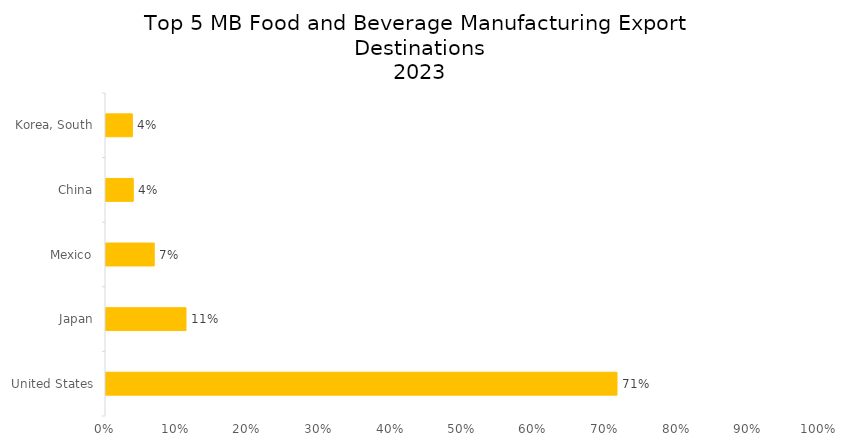
| Category | Series 0 |
|---|---|
| United States | 0.715 |
| Japan | 0.112 |
| Mexico | 0.067 |
| China | 0.038 |
| Korea, South | 0.037 |